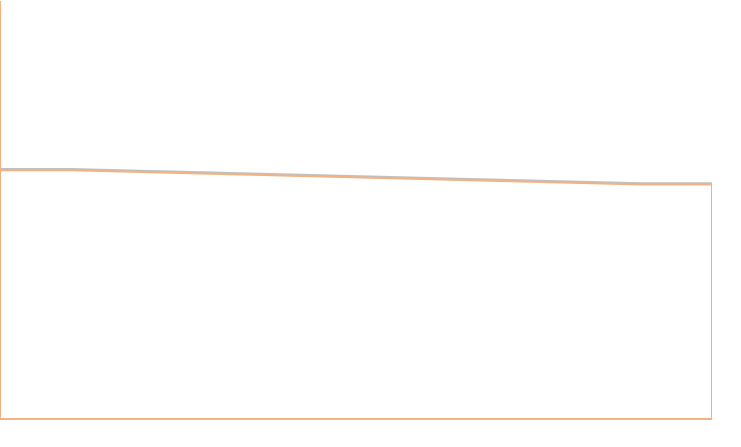
| Category | Series 0 | Series 1 | Series 2 |
|---|---|---|---|
| 0.0 | 1608.448 | 21.756 | 2382.957 |
| 10.0 | 1608.448 | 21.756 | 2382.957 |
| 90.0 | 1744.437 | 21.756 | 2246.968 |
| 100.0 | 1744.437 | 21.756 | 2246.968 |